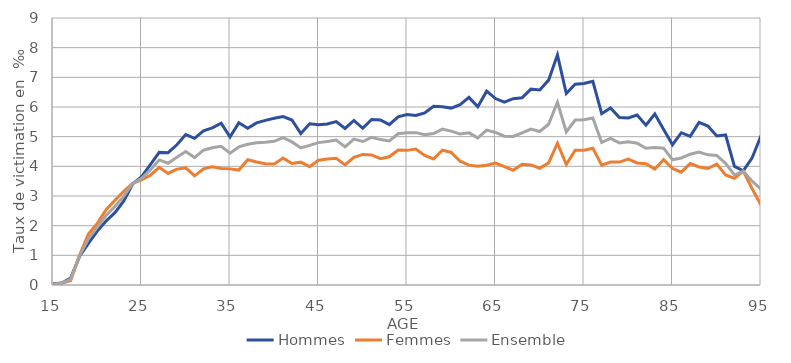
| Category | Hommes | Femmes | Ensemble |
|---|---|---|---|
| 15.0 | 0.039 | 0.015 | 0.028 |
| 16.0 | 0.067 | 0.06 | 0.064 |
| 17.0 | 0.238 | 0.154 | 0.197 |
| 18.0 | 0.963 | 1.004 | 0.983 |
| 19.0 | 1.406 | 1.722 | 1.56 |
| 20.0 | 1.818 | 2.071 | 1.942 |
| 21.0 | 2.157 | 2.538 | 2.345 |
| 22.0 | 2.438 | 2.859 | 2.646 |
| 23.0 | 2.836 | 3.159 | 2.997 |
| 24.0 | 3.404 | 3.428 | 3.416 |
| 25.0 | 3.648 | 3.544 | 3.596 |
| 26.0 | 4.056 | 3.701 | 3.878 |
| 27.0 | 4.47 | 3.965 | 4.215 |
| 28.0 | 4.46 | 3.761 | 4.105 |
| 29.0 | 4.726 | 3.907 | 4.309 |
| 30.0 | 5.071 | 3.947 | 4.498 |
| 31.0 | 4.943 | 3.678 | 4.295 |
| 32.0 | 5.198 | 3.914 | 4.544 |
| 33.0 | 5.298 | 3.985 | 4.626 |
| 34.0 | 5.452 | 3.929 | 4.673 |
| 35.0 | 4.994 | 3.914 | 4.443 |
| 36.0 | 5.466 | 3.874 | 4.655 |
| 37.0 | 5.281 | 4.222 | 4.743 |
| 38.0 | 5.464 | 4.144 | 4.792 |
| 39.0 | 5.549 | 4.091 | 4.809 |
| 40.0 | 5.621 | 4.08 | 4.845 |
| 41.0 | 5.679 | 4.278 | 4.971 |
| 42.0 | 5.561 | 4.098 | 4.823 |
| 43.0 | 5.106 | 4.141 | 4.62 |
| 44.0 | 5.436 | 3.989 | 4.707 |
| 45.0 | 5.4 | 4.206 | 4.799 |
| 46.0 | 5.428 | 4.251 | 4.836 |
| 47.0 | 5.51 | 4.27 | 4.886 |
| 48.0 | 5.277 | 4.047 | 4.656 |
| 49.0 | 5.546 | 4.306 | 4.916 |
| 50.0 | 5.283 | 4.402 | 4.837 |
| 51.0 | 5.581 | 4.386 | 4.975 |
| 52.0 | 5.561 | 4.258 | 4.901 |
| 53.0 | 5.405 | 4.323 | 4.854 |
| 54.0 | 5.668 | 4.548 | 5.097 |
| 55.0 | 5.747 | 4.538 | 5.129 |
| 56.0 | 5.717 | 4.582 | 5.136 |
| 57.0 | 5.803 | 4.367 | 5.065 |
| 58.0 | 6.024 | 4.248 | 5.105 |
| 59.0 | 6.01 | 4.545 | 5.252 |
| 60.0 | 5.963 | 4.468 | 5.187 |
| 61.0 | 6.082 | 4.172 | 5.087 |
| 62.0 | 6.324 | 4.04 | 5.129 |
| 63.0 | 6.009 | 4.004 | 4.958 |
| 64.0 | 6.535 | 4.038 | 5.222 |
| 65.0 | 6.285 | 4.111 | 5.141 |
| 66.0 | 6.161 | 3.989 | 5.017 |
| 67.0 | 6.279 | 3.87 | 5.009 |
| 68.0 | 6.31 | 4.072 | 5.125 |
| 69.0 | 6.602 | 4.048 | 5.254 |
| 70.0 | 6.575 | 3.936 | 5.174 |
| 71.0 | 6.906 | 4.116 | 5.418 |
| 72.0 | 7.758 | 4.779 | 6.16 |
| 73.0 | 6.453 | 4.06 | 5.162 |
| 74.0 | 6.765 | 4.543 | 5.56 |
| 75.0 | 6.791 | 4.545 | 5.571 |
| 76.0 | 6.866 | 4.612 | 5.628 |
| 77.0 | 5.774 | 4.04 | 4.807 |
| 78.0 | 5.968 | 4.144 | 4.942 |
| 79.0 | 5.648 | 4.144 | 4.789 |
| 80.0 | 5.629 | 4.246 | 4.828 |
| 81.0 | 5.727 | 4.113 | 4.779 |
| 82.0 | 5.385 | 4.087 | 4.608 |
| 83.0 | 5.763 | 3.909 | 4.635 |
| 84.0 | 5.242 | 4.224 | 4.612 |
| 85.0 | 4.728 | 3.927 | 4.223 |
| 86.0 | 5.133 | 3.804 | 4.282 |
| 87.0 | 5.008 | 4.093 | 4.41 |
| 88.0 | 5.481 | 3.977 | 4.48 |
| 89.0 | 5.357 | 3.927 | 4.386 |
| 90.0 | 5.023 | 4.075 | 4.369 |
| 91.0 | 5.057 | 3.71 | 4.102 |
| 92.0 | 3.996 | 3.596 | 3.708 |
| 93.0 | 3.847 | 3.838 | 3.84 |
| 94.0 | 4.29 | 3.245 | 3.5 |
| 95.0 | 5.032 | 2.698 | 3.227 |